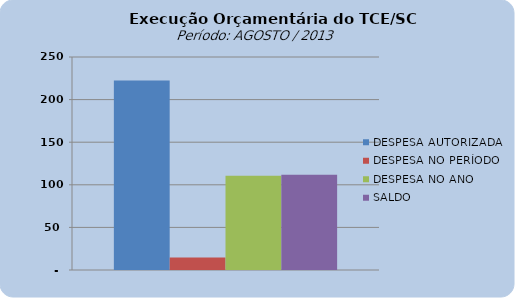
| Category | DESPESA AUTORIZADA | DESPESA NO PERÍODO | DESPESA NO ANO | SALDO |
|---|---|---|---|---|
| 0 | 222375231.62 | 14717380.99 | 110633815.1 | 111741416.52 |